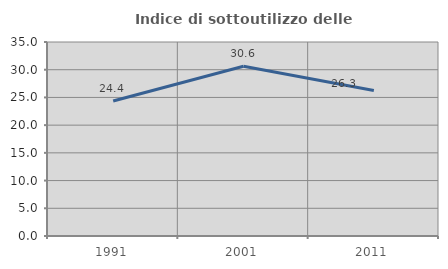
| Category | Indice di sottoutilizzo delle abitazioni  |
|---|---|
| 1991.0 | 24.352 |
| 2001.0 | 30.638 |
| 2011.0 | 26.255 |